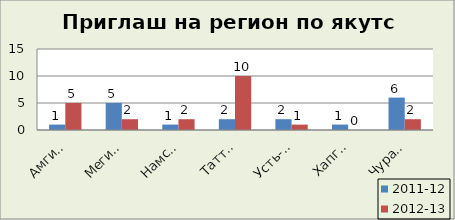
| Category | 2011-12 | 2012-13 |
|---|---|---|
| Амгинский | 1 | 5 |
| Мегино-Кангаласс | 5 | 2 |
| Намский | 1 | 2 |
| Таттинский | 2 | 10 |
| Усть-Алданский | 2 | 1 |
| Хапгаласский | 1 | 0 |
| Чурапчинский | 6 | 2 |